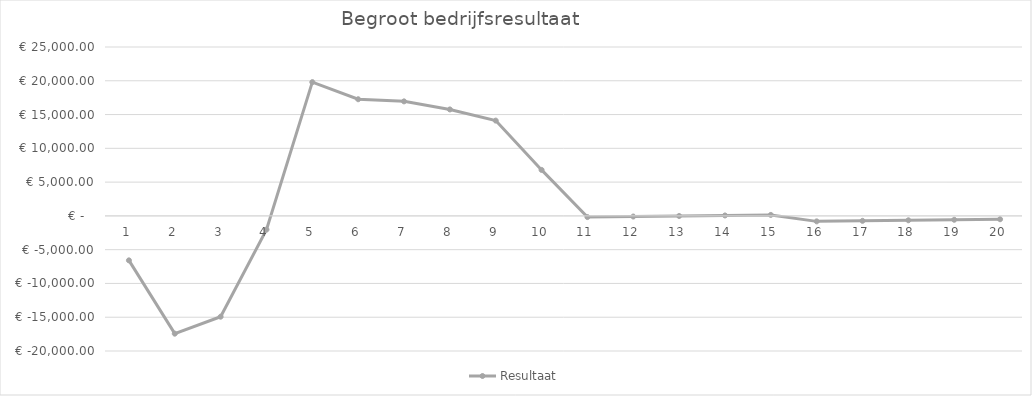
| Category | Resultaat |
|---|---|
| 0 | -6581.633 |
| 1 | -17434.623 |
| 2 | -14921.501 |
| 3 | -2032.483 |
| 4 | 19801.517 |
| 5 | 17266.531 |
| 6 | 16952.545 |
| 7 | 15758.085 |
| 8 | 14105.016 |
| 9 | 6805.2 |
| 10 | -174.494 |
| 11 | -95.048 |
| 12 | -15.602 |
| 13 | 63.845 |
| 14 | 143.291 |
| 15 | -811.278 |
| 16 | -731.832 |
| 17 | -652.385 |
| 18 | -572.939 |
| 19 | -493.492 |